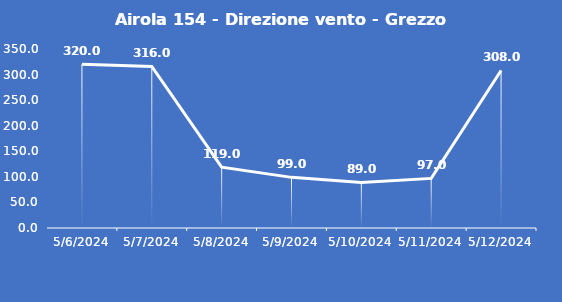
| Category | Airola 154 - Direzione vento - Grezzo (°N) |
|---|---|
| 5/6/24 | 320 |
| 5/7/24 | 316 |
| 5/8/24 | 119 |
| 5/9/24 | 99 |
| 5/10/24 | 89 |
| 5/11/24 | 97 |
| 5/12/24 | 308 |